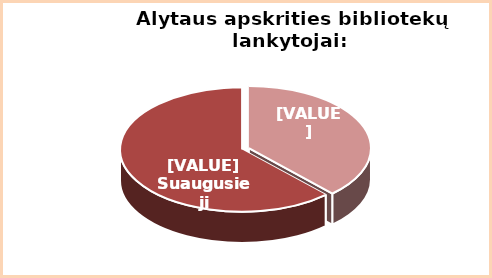
| Category | Series 0 |
|---|---|
| Vaikai | 0.38 |
| Suaugę | 0.62 |